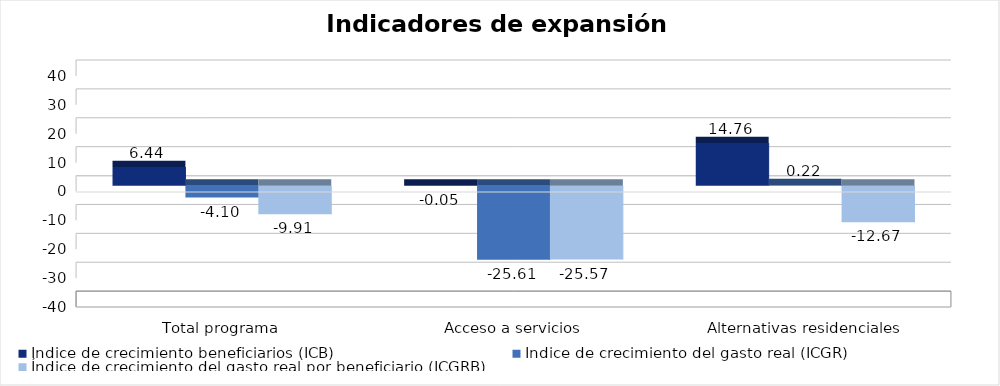
| Category | Índice de crecimiento beneficiarios (ICB)  | Índice de crecimiento del gasto real (ICGR)  | Índice de crecimiento del gasto real por beneficiario (ICGRB)  |
|---|---|---|---|
| Total programa | 6.445 | -4.102 | -9.908 |
| Acceso a servicios | -0.047 | -25.605 | -25.57 |
| Alternativas residenciales | 14.763 | 0.217 | -12.675 |